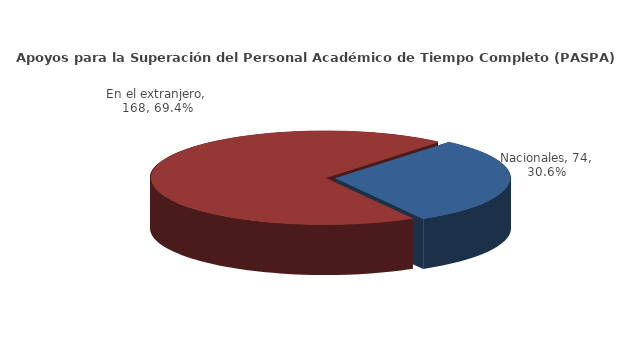
| Category | Series 0 |
|---|---|
| Nacionales | 74 |
| En el extranjero | 168 |